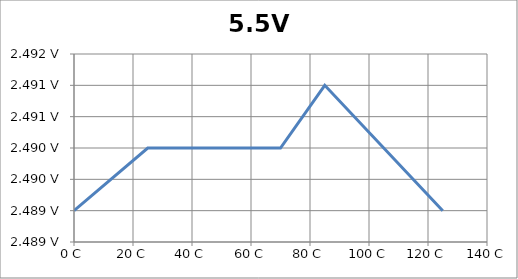
| Category | 5.5V 500mA |
|---|---|
| 0.0 | 2.489 |
| 25.0 | 2.49 |
| 70.0 | 2.49 |
| 85.0 | 2.491 |
| 125.0 | 2.489 |